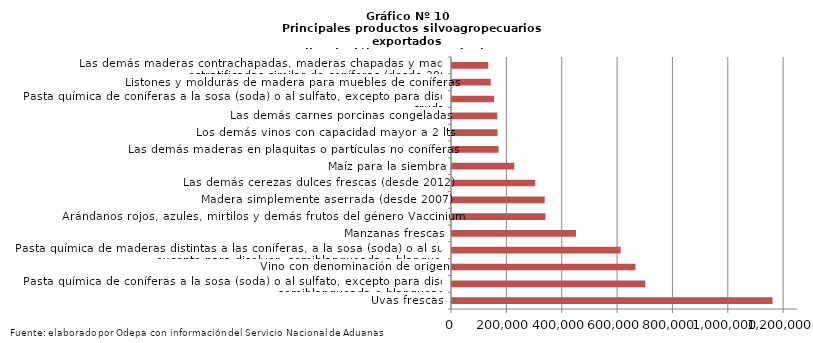
| Category | Series 0 |
|---|---|
| Uvas frescas | 1158158.551 |
| Pasta química de coníferas a la sosa (soda) o al sulfato, excepto para disolver, semiblanqueada o blanqueada | 698330.93 |
| Vino con denominación de origen | 662678.969 |
| Pasta química de maderas distintas a las coníferas, a la sosa (soda) o al sulfato, excepto para disolver, semiblanqueada o blanqueada | 609274.1 |
| Manzanas frescas | 447979.402 |
| Arándanos rojos, azules, mirtilos y demás frutos del género Vaccinium | 337096.576 |
| Madera simplemente aserrada (desde 2007) | 334937.97 |
| Las demás cerezas dulces frescas (desde 2012) | 300619.025 |
| Maíz para la siembra | 225064.205 |
| Las demás maderas en plaquitas o partículas no coníferas | 168305.001 |
| Los demás vinos con capacidad mayor a 2 lts | 164628.38 |
| Las demás carnes porcinas congeladas | 163299.782 |
| Pasta química de coníferas a la sosa (soda) o al sulfato, excepto para disolver, cruda | 152355.246 |
| Listones y molduras de madera para muebles de coníferas | 139975.674 |
| Las demás maderas contrachapadas, maderas chapadas y maderas estratificadas similar de coníferas (desde 2007) | 131030.452 |